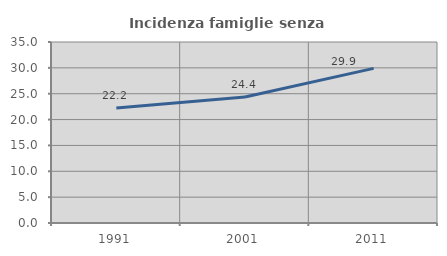
| Category | Incidenza famiglie senza nuclei |
|---|---|
| 1991.0 | 22.232 |
| 2001.0 | 24.364 |
| 2011.0 | 29.896 |